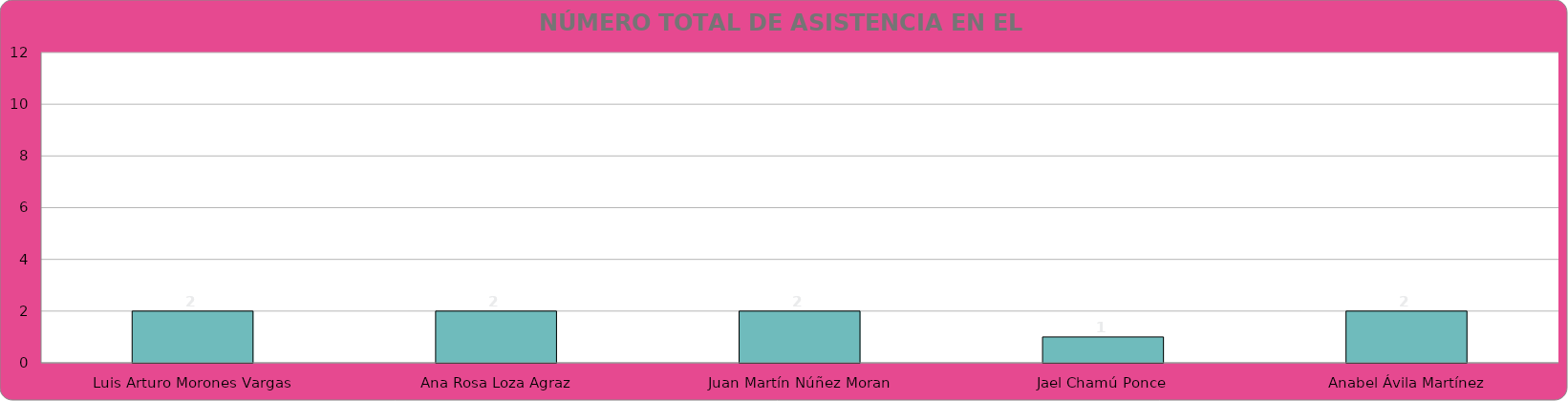
| Category | Jael Chamú Ponce Fernanda Janeth Martínez Núñez Adriana del Carmen Zúñiga Guerrero Ana Rosa Loza Agraz María del Rosario Velázquez Hernández |
|---|---|
| Luis Arturo Morones Vargas | 2 |
| Ana Rosa Loza Agraz | 2 |
| Juan Martín Núñez Moran | 2 |
| Jael Chamú Ponce | 1 |
| Anabel Ávila Martínez | 2 |